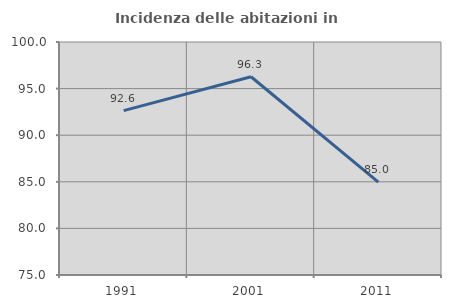
| Category | Incidenza delle abitazioni in proprietà  |
|---|---|
| 1991.0 | 92.638 |
| 2001.0 | 96.269 |
| 2011.0 | 84.956 |